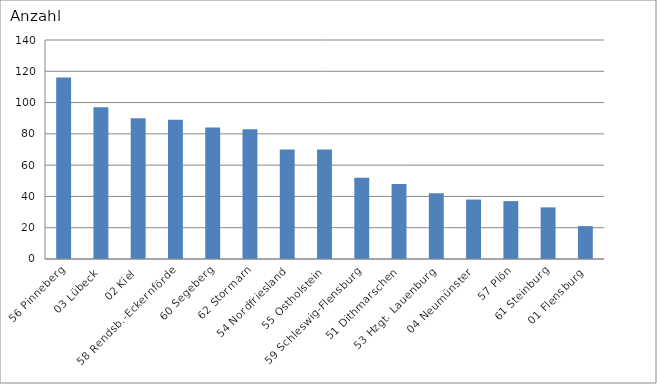
| Category | 56 Pinneberg |
|---|---|
| 56 Pinneberg | 116 |
| 03 Lübeck | 97 |
| 02 Kiel | 90 |
| 58 Rendsb.-Eckernförde | 89 |
| 60 Segeberg | 84 |
| 62 Stormarn | 83 |
| 54 Nordfriesland | 70 |
| 55 Ostholstein | 70 |
| 59 Schleswig-Flensburg | 52 |
| 51 Dithmarschen | 48 |
| 53 Hzgt. Lauenburg | 42 |
| 04 Neumünster | 38 |
| 57 Plön | 37 |
| 61 Steinburg | 33 |
| 01 Flensburg | 21 |